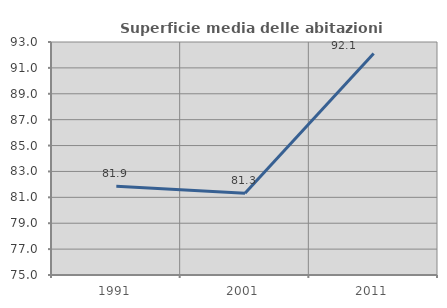
| Category | Superficie media delle abitazioni occupate |
|---|---|
| 1991.0 | 81.866 |
| 2001.0 | 81.312 |
| 2011.0 | 92.11 |